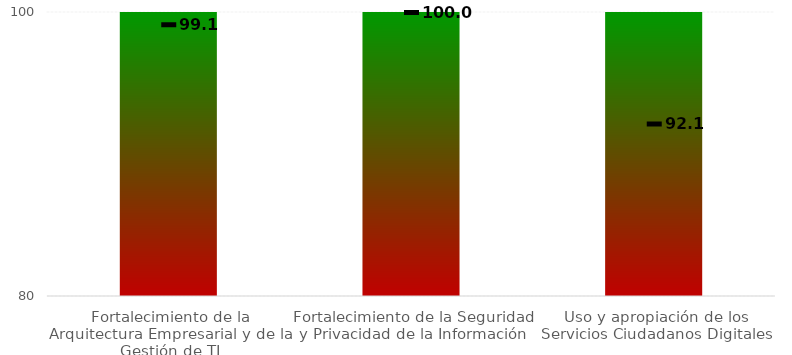
| Category | Rangos |
|---|---|
| Fortalecimiento de la Arquitectura Empresarial y de la Gestión de TI | 100 |
| Fortalecimiento de la Seguridad y Privacidad de la Información | 100 |
| Uso y apropiación de los Servicios Ciudadanos Digitales | 100 |